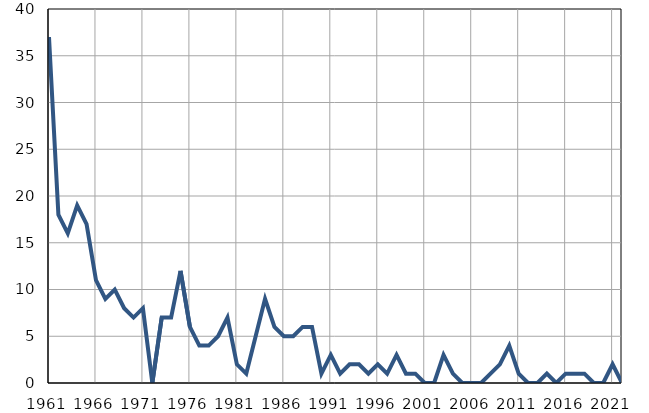
| Category | Умрла 
одојчад |
|---|---|
| 1961.0 | 37 |
| 1962.0 | 18 |
| 1963.0 | 16 |
| 1964.0 | 19 |
| 1965.0 | 17 |
| 1966.0 | 11 |
| 1967.0 | 9 |
| 1968.0 | 10 |
| 1969.0 | 8 |
| 1970.0 | 7 |
| 1971.0 | 8 |
| 1972.0 | 0 |
| 1973.0 | 7 |
| 1974.0 | 7 |
| 1975.0 | 12 |
| 1976.0 | 6 |
| 1977.0 | 4 |
| 1978.0 | 4 |
| 1979.0 | 5 |
| 1980.0 | 7 |
| 1981.0 | 2 |
| 1982.0 | 1 |
| 1983.0 | 5 |
| 1984.0 | 9 |
| 1985.0 | 6 |
| 1986.0 | 5 |
| 1987.0 | 5 |
| 1988.0 | 6 |
| 1989.0 | 6 |
| 1990.0 | 1 |
| 1991.0 | 3 |
| 1992.0 | 1 |
| 1993.0 | 2 |
| 1994.0 | 2 |
| 1995.0 | 1 |
| 1996.0 | 2 |
| 1997.0 | 1 |
| 1998.0 | 3 |
| 1999.0 | 1 |
| 2000.0 | 1 |
| 2001.0 | 0 |
| 2002.0 | 0 |
| 2003.0 | 3 |
| 2004.0 | 1 |
| 2005.0 | 0 |
| 2006.0 | 0 |
| 2007.0 | 0 |
| 2008.0 | 1 |
| 2009.0 | 2 |
| 2010.0 | 4 |
| 2011.0 | 1 |
| 2012.0 | 0 |
| 2013.0 | 0 |
| 2014.0 | 1 |
| 2015.0 | 0 |
| 2016.0 | 1 |
| 2017.0 | 1 |
| 2018.0 | 1 |
| 2019.0 | 0 |
| 2020.0 | 0 |
| 2021.0 | 2 |
| 2022.0 | 0 |